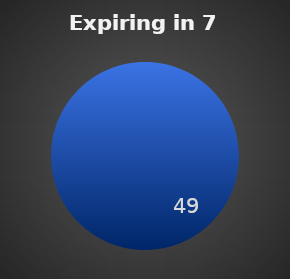
| Category | Expiring in 7 Days |
|---|---|
| 0 | 49 |